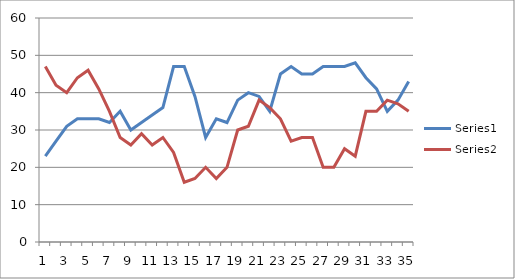
| Category | Series 0 | Series 1 |
|---|---|---|
| 0 | 23 | 47 |
| 1 | 27 | 42 |
| 2 | 31 | 40 |
| 3 | 33 | 44 |
| 4 | 33 | 46 |
| 5 | 33 | 41 |
| 6 | 32 | 35 |
| 7 | 35 | 28 |
| 8 | 30 | 26 |
| 9 | 32 | 29 |
| 10 | 34 | 26 |
| 11 | 36 | 28 |
| 12 | 47 | 24 |
| 13 | 47 | 16 |
| 14 | 39 | 17 |
| 15 | 28 | 20 |
| 16 | 33 | 17 |
| 17 | 32 | 20 |
| 18 | 38 | 30 |
| 19 | 40 | 31 |
| 20 | 39 | 38 |
| 21 | 35 | 36 |
| 22 | 45 | 33 |
| 23 | 47 | 27 |
| 24 | 45 | 28 |
| 25 | 45 | 28 |
| 26 | 47 | 20 |
| 27 | 47 | 20 |
| 28 | 47 | 25 |
| 29 | 48 | 23 |
| 30 | 44 | 35 |
| 31 | 41 | 35 |
| 32 | 35 | 38 |
| 33 | 38 | 37 |
| 34 | 43 | 35 |